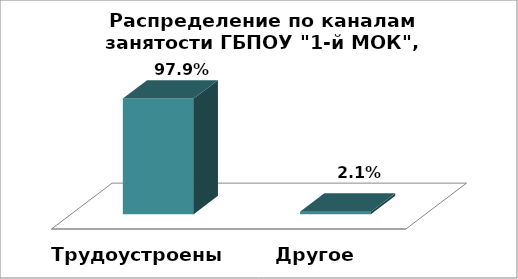
| Category | Series 0 |
|---|---|
| Трудоустроены | 0.979 |
| Другое | 0.021 |